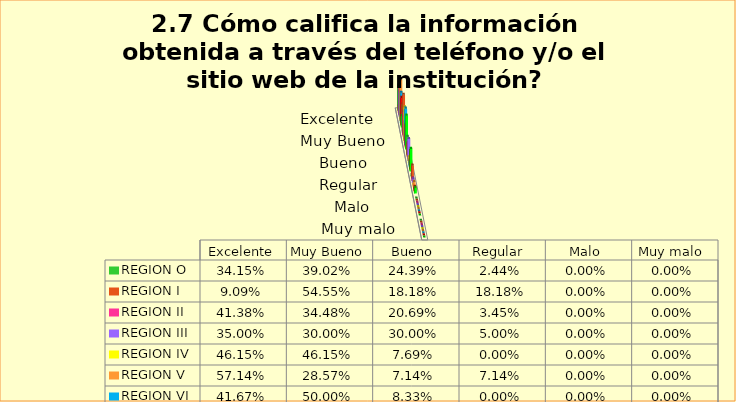
| Category | REGION O | REGION I  | REGION II | REGION III | REGION IV | REGION V  | REGION VI  | REGION VII  | REGION VIII |
|---|---|---|---|---|---|---|---|---|---|
| Excelente | 0.341 | 0.091 | 0.414 | 0.35 | 0.462 | 0.571 | 0.417 | 0.375 | 0.154 |
| Muy Bueno | 0.39 | 0.545 | 0.345 | 0.3 | 0.462 | 0.286 | 0.5 | 0.312 | 0.462 |
| Bueno  | 0.244 | 0.182 | 0.207 | 0.3 | 0.077 | 0.071 | 0.083 | 0.25 | 0.308 |
| Regular  | 0.024 | 0.182 | 0.034 | 0.05 | 0 | 0.071 | 0 | 0.062 | 0.077 |
| Malo  | 0 | 0 | 0 | 0 | 0 | 0 | 0 | 0 | 0 |
| Muy malo  | 0 | 0 | 0 | 0 | 0 | 0 | 0 | 0 | 0 |